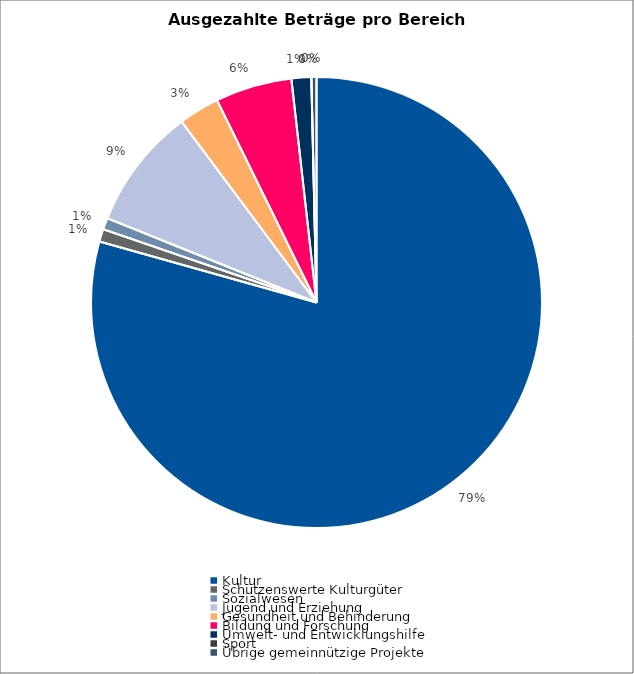
| Category | Series 0 |
|---|---|
| Kultur | 867991 |
| Schützenswerte Kulturgüter | 10000 |
| Sozialwesen | 9000 |
| Jugend und Erziehung | 95238 |
| Gesundheit und Behinderung | 32000 |
| Bildung und Forschung | 60096 |
| Umwelt- und Entwicklungshilfe | 15500 |
| Sport | 0 |
| Übrige gemeinnützige Projekte | 4000 |